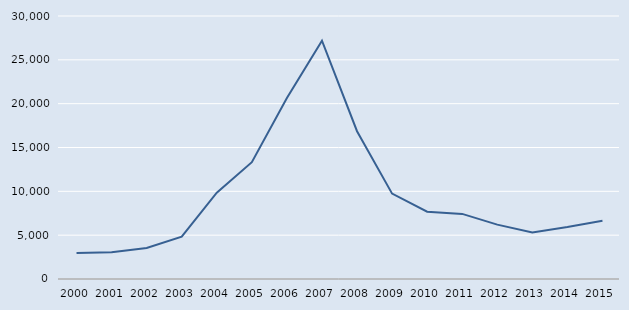
| Category | Series 0 |
|---|---|
| 2000.0 | 2968 |
| 2001.0 | 3057 |
| 2002.0 | 3538 |
| 2003.0 | 4825 |
| 2004.0 | 9851 |
| 2005.0 | 13327 |
| 2006.0 | 20658 |
| 2007.0 | 27178 |
| 2008.0 | 16857 |
| 2009.0 | 9739 |
| 2010.0 | 7678 |
| 2011.0 | 7424 |
| 2012.0 | 6201 |
| 2013.0 | 5302 |
| 2014.0 | 5923 |
| 2015.0 | 6638 |